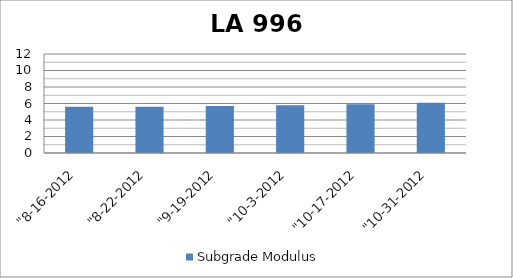
| Category | Subgrade Modulus |
|---|---|
| "8-16-2012 | 5.6 |
| "8-22-2012 | 5.6 |
| "9-19-2012 | 5.7 |
| "10-3-2012 | 5.8 |
| "10-17-2012 | 5.9 |
| "10-31-2012 | 6.1 |